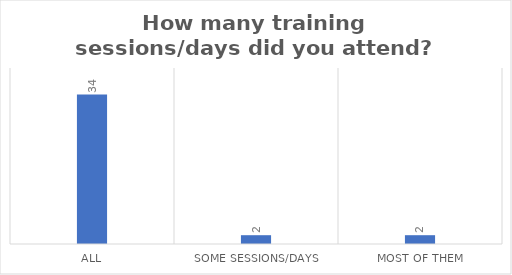
| Category | How many training sessions/days did you attend?  |
|---|---|
| All | 34 |
| Some sessions/days | 2 |
| Most of them | 2 |